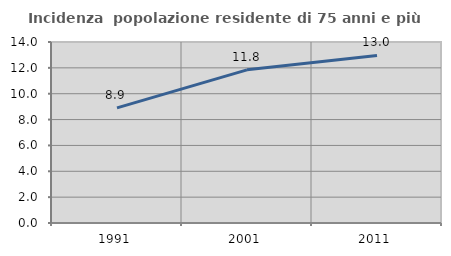
| Category | Incidenza  popolazione residente di 75 anni e più |
|---|---|
| 1991.0 | 8.902 |
| 2001.0 | 11.846 |
| 2011.0 | 12.963 |